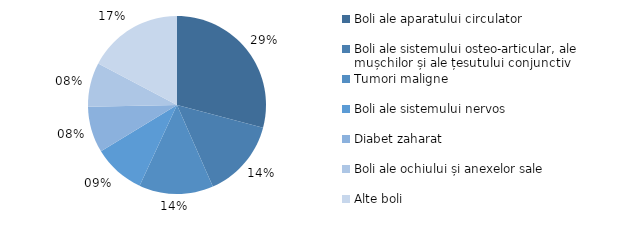
| Category | 2020 |
|---|---|
| Boli ale aparatului circulator | 29.1 |
| Boli ale sistemului osteo-articular, ale mușchilor și ale țesutului conjunctiv | 14.3 |
| Tumori maligne | 13.5 |
| Boli ale sistemului nervos | 9.4 |
| Diabet zaharat | 8.4 |
| Boli ale ochiului și anexelor sale | 8 |
| Alte boli | 17.3 |